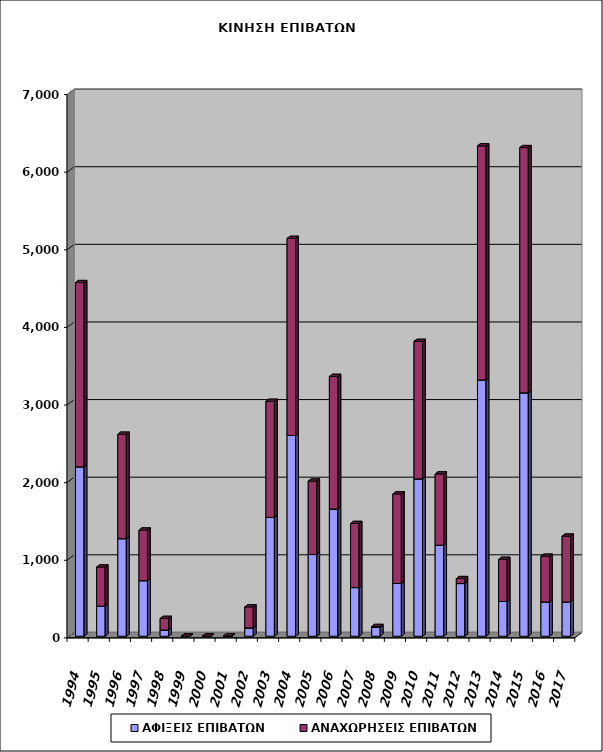
| Category | ΑΦΙΞΕΙΣ ΕΠΙΒΑΤΩΝ | ΑΝΑΧΩΡΗΣΕΙΣ ΕΠΙΒΑΤΩΝ |
|---|---|---|
| 1994.0 | 2182 | 2375 |
| 1995.0 | 387 | 506 |
| 1996.0 | 1257 | 1346 |
| 1997.0 | 716 | 652 |
| 1998.0 | 80 | 150 |
| 1999.0 | 0 | 0 |
| 2000.0 | 2 | 0 |
| 2001.0 | 0 | 5 |
| 2002.0 | 107 | 272 |
| 2003.0 | 1531 | 1496 |
| 2004.0 | 2587 | 2539 |
| 2005.0 | 1053 | 946 |
| 2006.0 | 1639 | 1709 |
| 2007.0 | 627 | 826 |
| 2008.0 | 113 | 13 |
| 2009.0 | 680 | 1154 |
| 2010.0 | 2027 | 1772 |
| 2011.0 | 1173 | 918 |
| 2012.0 | 679 | 64 |
| 2013.0 | 3302 | 3016 |
| 2014.0 | 448 | 543 |
| 2015.0 | 3136 | 3160 |
| 2016.0 | 441 | 590 |
| 2017.0 | 441 | 849 |